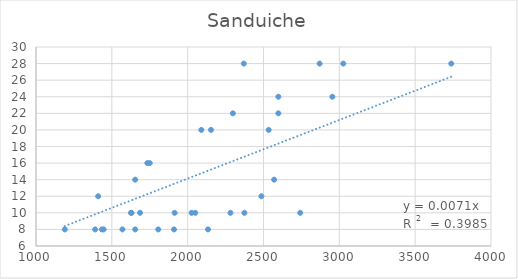
| Category | Sanduiche |
|---|---|
| 2870.0 | 28 |
| 1570.0 | 8 |
| 2374.0 | 10 |
| 2026.0 | 10 |
| 1410.0 | 12 |
| 2598.0 | 24 |
| 2370.0 | 28 |
| 1910.0 | 8 |
| 3738.0 | 28 |
| 2570.0 | 14 |
| 1654.0 | 14 |
| 1630.0 | 10 |
| 1626.0 | 10 |
| 1390.0 | 8 |
| 2298.0 | 22 |
| 1190.0 | 8 |
| 2742.0 | 10 |
| 2486.0 | 12 |
| 1446.0 | 8 |
| 2534.0 | 20 |
| 2090.0 | 20 |
| 1806.0 | 8 |
| 1654.0 | 8 |
| 2050.0 | 10 |
| 2134.0 | 8 |
| 1434.0 | 8 |
| 1914.0 | 10 |
| 1734.0 | 16 |
| 2282.0 | 10 |
| 2954.0 | 24 |
| 1686.0 | 10 |
| 2598.0 | 22 |
| 1750.0 | 16 |
| 3026.0 | 28 |
| 2154.0 | 20 |